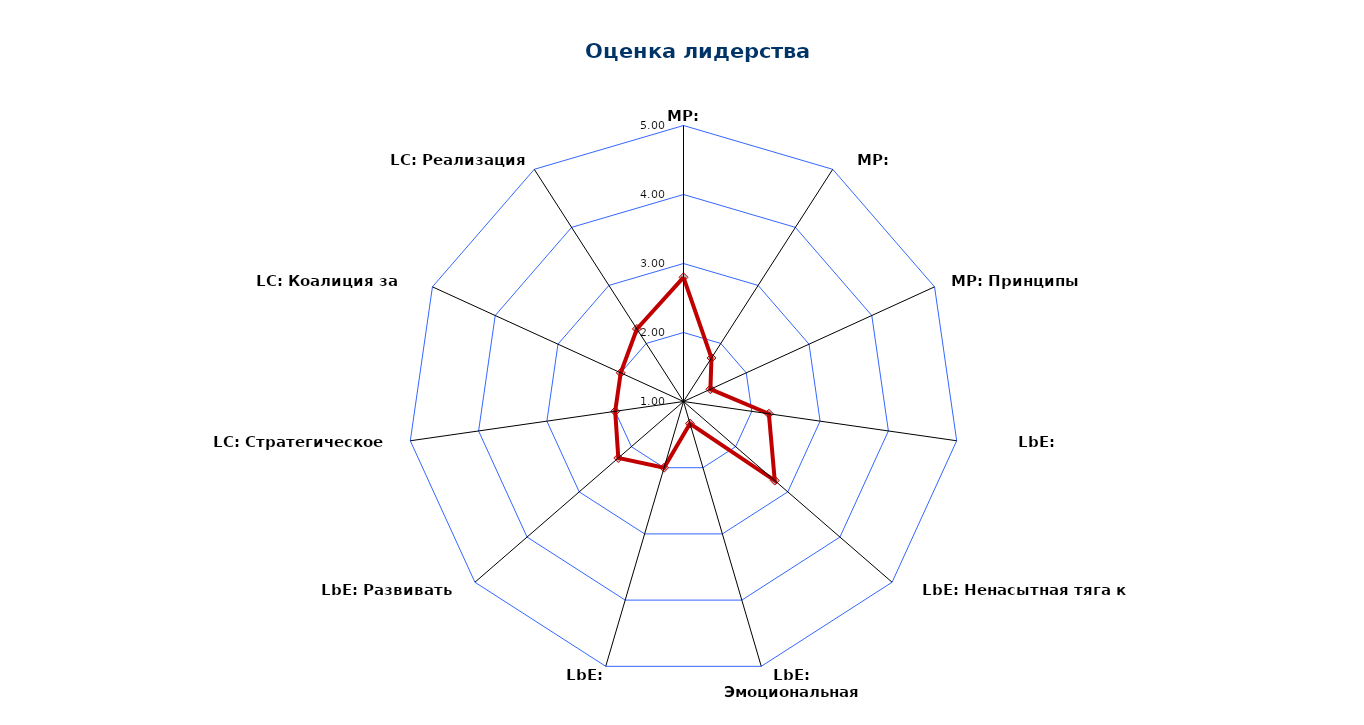
| Category | Series 0 |
|---|---|
| MP: Мышление | 2.8 |
| MP: Ценности | 1.75 |
| MP: Принципы SAFe | 1.429 |
| LbE: Достоверность | 2.25 |
| LbE: Ненасытная тяга к знаниям | 2.75 |
| LbE: Эмоциональная компетентность | 1.333 |
| LbE: Мужество | 2 |
| LbE: Развивать других | 2.25 |
| LC: Стратегическое видение | 2 |
| LC: Коалиция за перемены | 2 |
| LC: Реализация изменений | 2.25 |